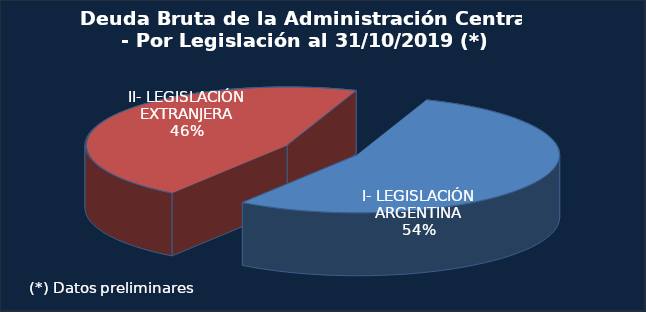
| Category | Series 0 |
|---|---|
| I- LEGISLACIÓN ARGENTINA | 167949.4 |
| II- LEGISLACIÓN EXTRANJERA | 142529.2 |